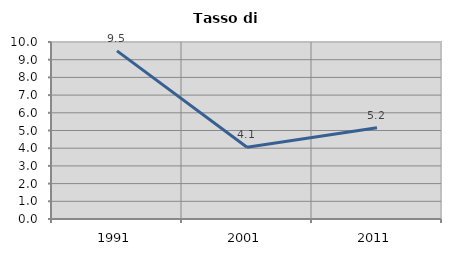
| Category | Tasso di disoccupazione   |
|---|---|
| 1991.0 | 9.498 |
| 2001.0 | 4.056 |
| 2011.0 | 5.158 |